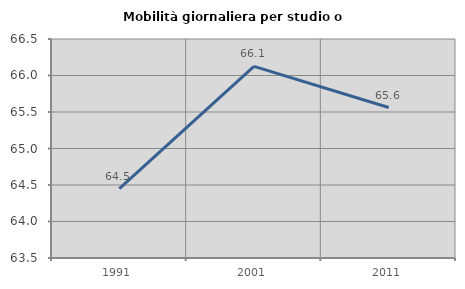
| Category | Mobilità giornaliera per studio o lavoro |
|---|---|
| 1991.0 | 64.45 |
| 2001.0 | 66.126 |
| 2011.0 | 65.561 |